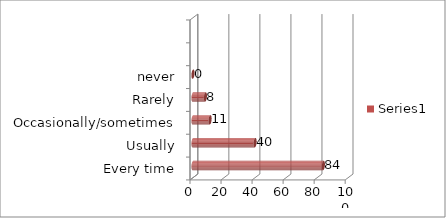
| Category | Series 0 |
|---|---|
| Every time | 84 |
| Usually | 40 |
| Occasionally/sometimes | 11 |
| Rarely | 8 |
| never | 0 |